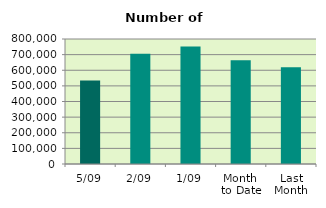
| Category | Series 0 |
|---|---|
| 5/09 | 533914 |
| 2/09 | 705756 |
| 1/09 | 751316 |
| Month 
to Date | 663662 |
| Last
Month | 618945.565 |